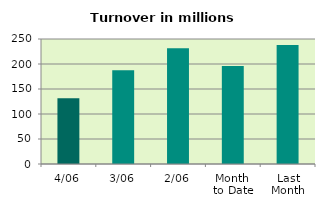
| Category | Series 0 |
|---|---|
| 4/06 | 131.614 |
| 3/06 | 187.597 |
| 2/06 | 231.629 |
| Month 
to Date | 196.179 |
| Last
Month | 237.894 |